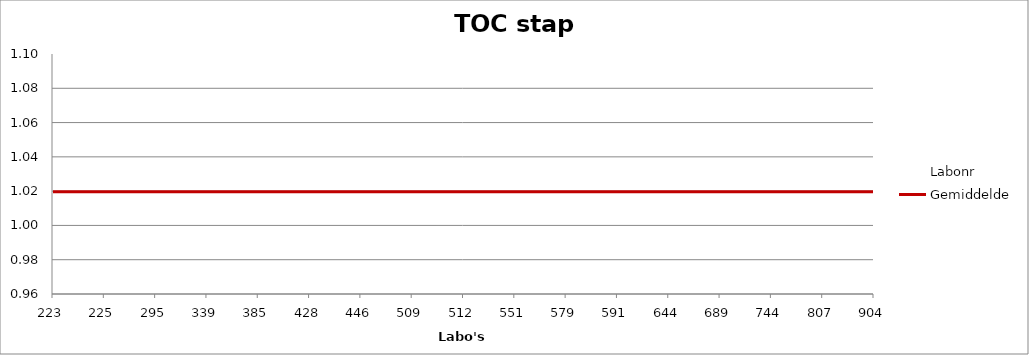
| Category | Labonr | Gemiddelde |
|---|---|---|
| 223.0 | 0.991 | 1.02 |
| 225.0 | 1.017 | 1.02 |
| 295.0 | 1.018 | 1.02 |
| 339.0 | 0.997 | 1.02 |
| 385.0 | 1.065 | 1.02 |
| 428.0 | 1.018 | 1.02 |
| 446.0 | 1.044 | 1.02 |
| 509.0 | 1.094 | 1.02 |
| 512.0 | 1.049 | 1.02 |
| 551.0 | 1.013 | 1.02 |
| 579.0 | 0.983 | 1.02 |
| 591.0 | 0.991 | 1.02 |
| 644.0 | 1.029 | 1.02 |
| 689.0 | 0.991 | 1.02 |
| 744.0 | 0.997 | 1.02 |
| 807.0 | 1.02 | 1.02 |
| 904.0 | 1.046 | 1.02 |